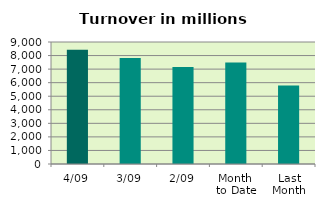
| Category | Series 0 |
|---|---|
| 4/09 | 8421.847 |
| 3/09 | 7817.145 |
| 2/09 | 7155.112 |
| Month 
to Date | 7496.194 |
| Last
Month | 5795.357 |